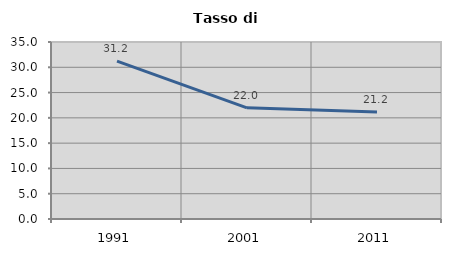
| Category | Tasso di disoccupazione   |
|---|---|
| 1991.0 | 31.208 |
| 2001.0 | 21.987 |
| 2011.0 | 21.158 |